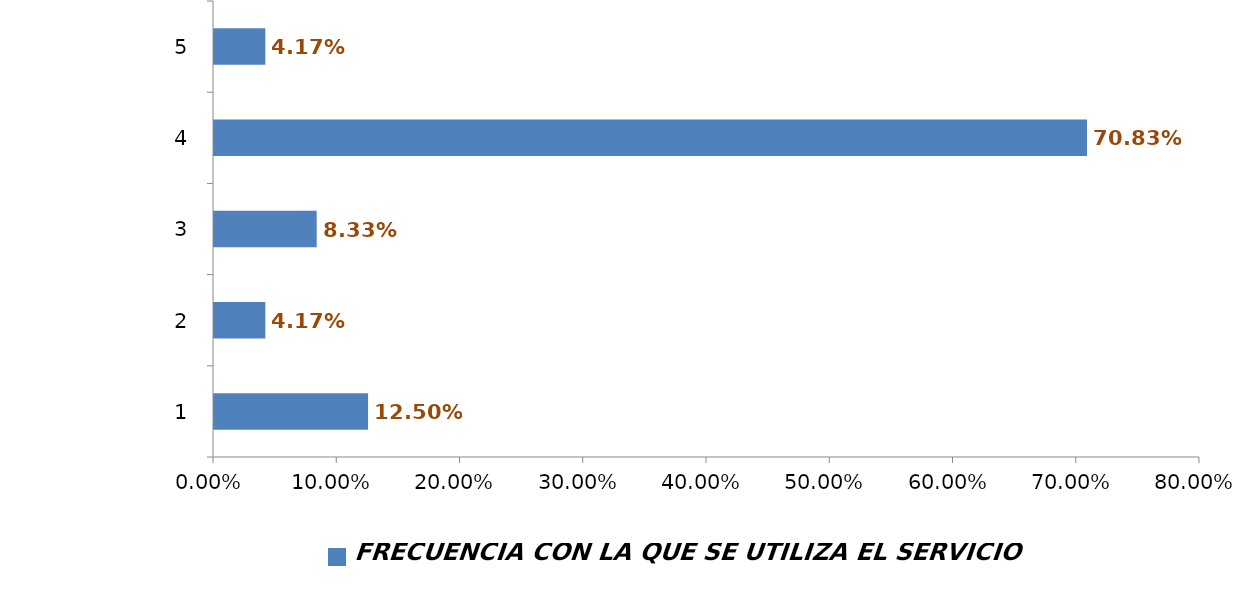
| Category | FRECUENCIA CON LA QUE SE UTILIZA EL SERVICIO |
|---|---|
| 0 | 0.125 |
| 1 | 0.042 |
| 2 | 0.083 |
| 3 | 0.708 |
| 4 | 0.042 |